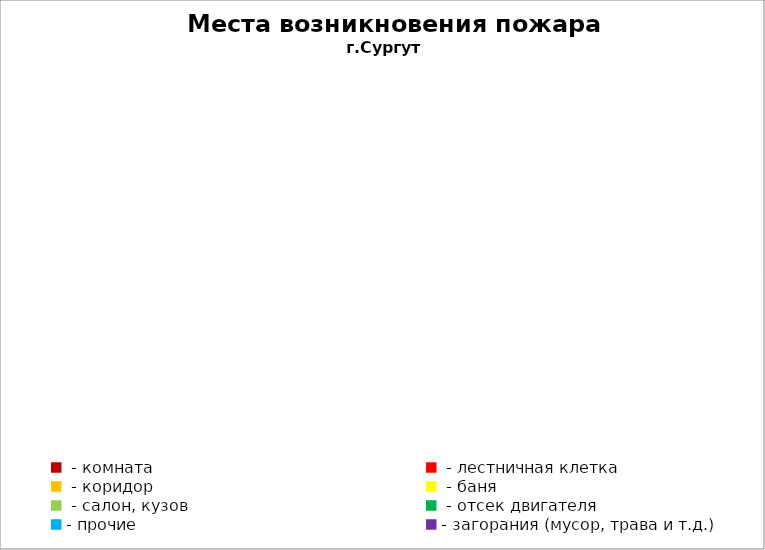
| Category | Места возникновения пожара |
|---|---|
|  - комната | 49 |
|  - лестничная клетка | 9 |
|  - коридор | 8 |
|  - баня | 25 |
|  - салон, кузов | 15 |
|  - отсек двигателя | 31 |
| - прочие | 66 |
| - загорания (мусор, трава и т.д.)  | 126 |